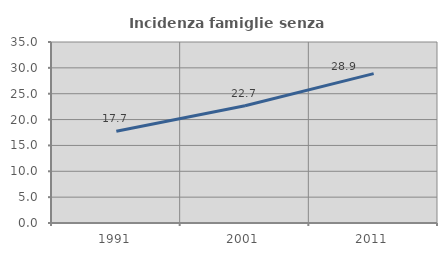
| Category | Incidenza famiglie senza nuclei |
|---|---|
| 1991.0 | 17.73 |
| 2001.0 | 22.662 |
| 2011.0 | 28.878 |